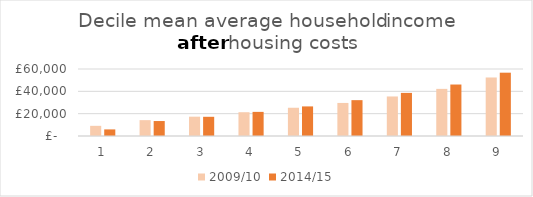
| Category | 2009/10 | 2014/15 |
|---|---|---|
| 0 | 9100 | 5900 |
| 1 | 14200 | 13400 |
| 2 | 17300 | 17200 |
| 3 | 21300 | 21600 |
| 4 | 25300 | 26500 |
| 5 | 29600 | 32100 |
| 6 | 35400 | 38600 |
| 7 | 42200 | 46100 |
| 8 | 52400 | 56700 |